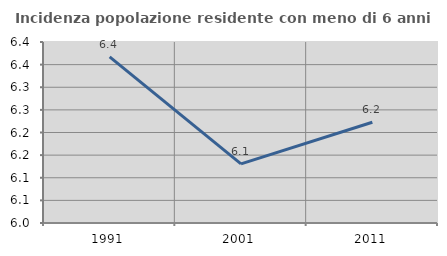
| Category | Incidenza popolazione residente con meno di 6 anni |
|---|---|
| 1991.0 | 6.367 |
| 2001.0 | 6.131 |
| 2011.0 | 6.223 |